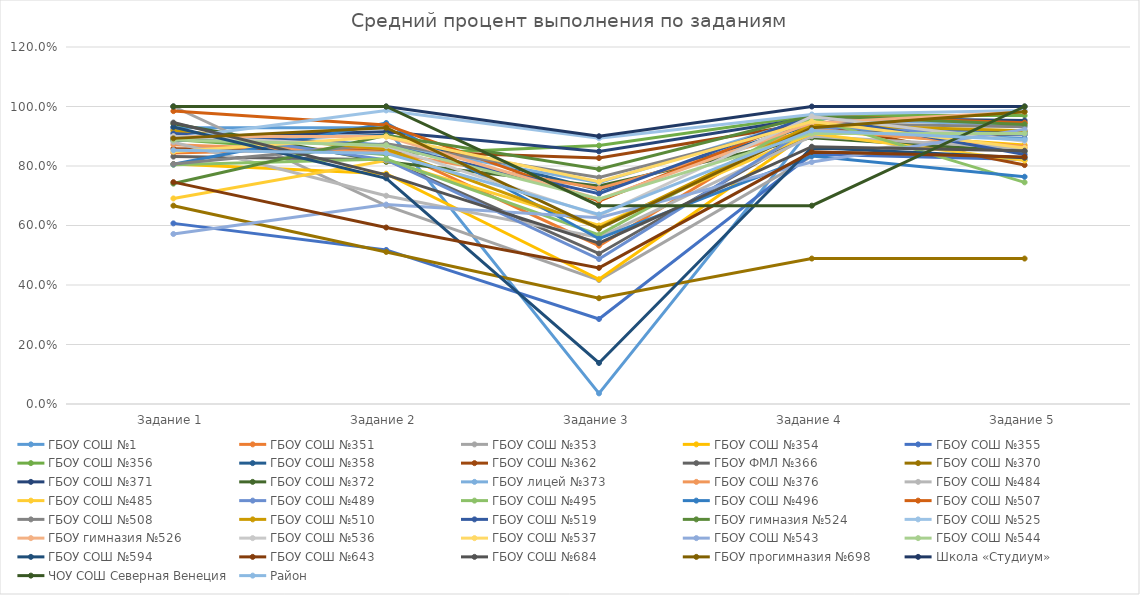
| Category | ГБОУ СОШ №1 | ГБОУ СОШ №351 | ГБОУ СОШ №353 | ГБОУ СОШ №354 | ГБОУ СОШ №355 | ГБОУ СОШ №356 | ГБОУ СОШ №358  | ГБОУ СОШ №362 | ГБОУ ФМЛ №366 | ГБОУ СОШ №370 | ГБОУ СОШ №371 | ГБОУ СОШ №372 | ГБОУ лицей №373 | ГБОУ СОШ №376 | ГБОУ СОШ №484 | ГБОУ СОШ №485 | ГБОУ СОШ №489 | ГБОУ СОШ №495 | ГБОУ СОШ №496 | ГБОУ СОШ №507 | ГБОУ СОШ №508 | ГБОУ СОШ №510 | ГБОУ СОШ №519 | ГБОУ гимназия №524 | ГБОУ СОШ №525 | ГБОУ гимназия №526 | ГБОУ СОШ №536 | ГБОУ СОШ №537 | ГБОУ СОШ №543 | ГБОУ СОШ №544 | ГБОУ СОШ №594 | ГБОУ СОШ №643 | ГБОУ СОШ №684 | ГБОУ прогимназия №698 | Школа «Студиум» | ЧОУ СОШ Северная Венеция | Район |
|---|---|---|---|---|---|---|---|---|---|---|---|---|---|---|---|---|---|---|---|---|---|---|---|---|---|---|---|---|---|---|---|---|---|---|---|---|---|
| Задание 1 | 0.929 | 0.844 | 1 | 0.806 | 0.607 | 0.889 | 0.886 | 0.858 | 0.832 | 0.667 | 0.896 | 0.942 | 0.91 | 0.872 | 0.88 | 0.691 | 0.923 | 0.804 | 0.806 | 0.984 | 0.807 | 0.918 | 0.909 | 0.741 | 0.893 | 0.899 | 0.9 | 0.848 | 0.571 | 0.887 | 0.931 | 0.746 | 0.946 | 0.893 | 1 | 1 | 0.853 |
| Задание 2 | 0.929 | 0.862 | 0.667 | 0.774 | 0.518 | 0.838 | 0.904 | 0.85 | 0.821 | 0.511 | 0.915 | 0.814 | 0.872 | 0.846 | 0.7 | 0.818 | 0.821 | 0.824 | 0.944 | 0.938 | 0.875 | 0.857 | 0.869 | 0.904 | 0.987 | 0.899 | 0.867 | 0.899 | 0.67 | 0.87 | 0.759 | 0.593 | 0.77 | 0.929 | 1 | 1 | 0.842 |
| Задание 3 | 0.036 | 0.532 | 0.417 | 0.419 | 0.286 | 0.869 | 0.719 | 0.827 | 0.505 | 0.356 | 0.849 | 0.733 | 0.744 | 0.724 | 0.56 | 0.6 | 0.487 | 0.569 | 0.556 | 0.682 | 0.761 | 0.592 | 0.707 | 0.789 | 0.893 | 0.688 | 0.633 | 0.747 | 0.626 | 0.689 | 0.138 | 0.458 | 0.541 | 0.589 | 0.9 | 0.667 | 0.637 |
| Задание 4 | 0.929 | 0.963 | 0.833 | 0.919 | 0.839 | 0.97 | 0.939 | 0.945 | 0.916 | 0.489 | 0.962 | 0.895 | 0.962 | 0.923 | 0.9 | 0.909 | 0.932 | 0.961 | 0.833 | 0.969 | 0.943 | 0.939 | 0.97 | 0.97 | 0.973 | 0.945 | 0.967 | 0.949 | 0.813 | 0.91 | 0.862 | 0.847 | 0.865 | 0.929 | 1 | 0.667 | 0.92 |
| Задание 5 | 0.893 | 0.945 | 0.917 | 0.871 | 0.821 | 0.97 | 0.912 | 0.803 | 0.905 | 0.489 | 0.953 | 0.849 | 0.936 | 0.865 | 0.86 | 0.818 | 0.906 | 0.745 | 0.764 | 0.946 | 0.932 | 0.918 | 0.838 | 0.94 | 0.987 | 0.982 | 0.883 | 0.861 | 0.923 | 0.91 | 0.828 | 0.831 | 0.851 | 0.982 | 1 | 1 | 0.888 |